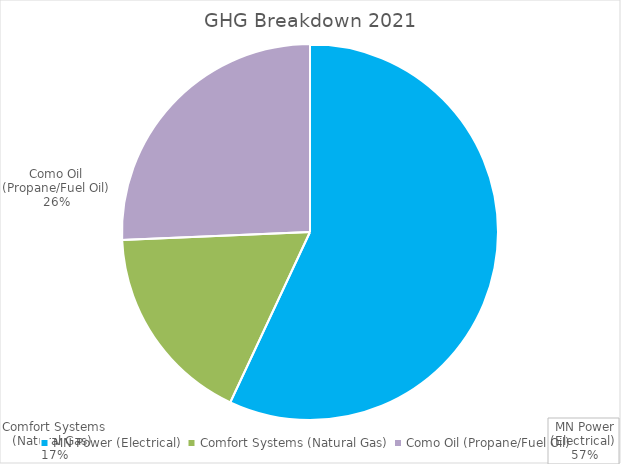
| Category | MN Power (Electrical)  |
|---|---|
| MN Power (Electrical)  | 577.314 |
| Comfort Systems (Natural Gas)  | 176.039 |
| Como Oil (Propane/Fuel Oil) | 260.133 |